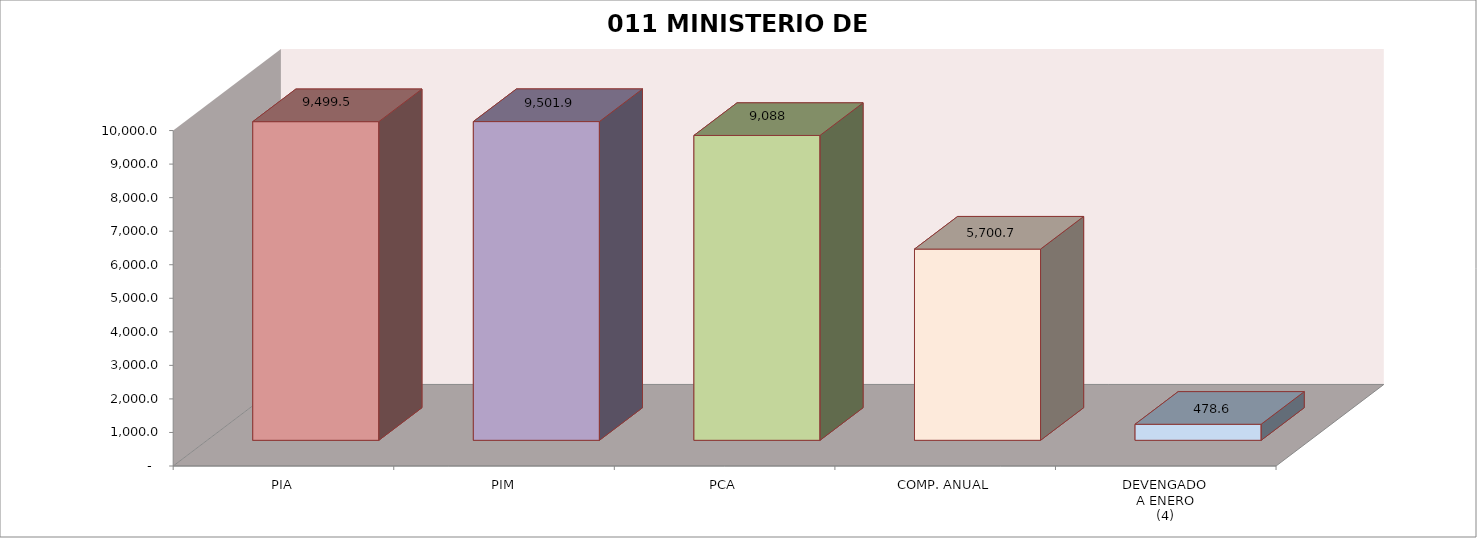
| Category | 011 MINISTERIO DE SALUD |
|---|---|
| PIA | 9499.522 |
| PIM | 9501.912 |
| PCA | 9088.168 |
| COMP. ANUAL | 5700.725 |
| DEVENGADO
A ENERO
(4) | 478.603 |